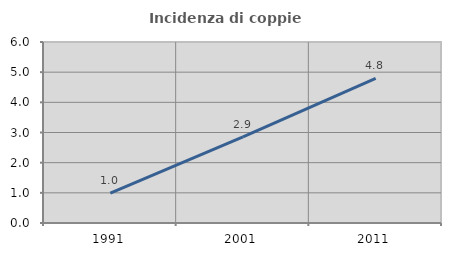
| Category | Incidenza di coppie miste |
|---|---|
| 1991.0 | 0.989 |
| 2001.0 | 2.856 |
| 2011.0 | 4.795 |